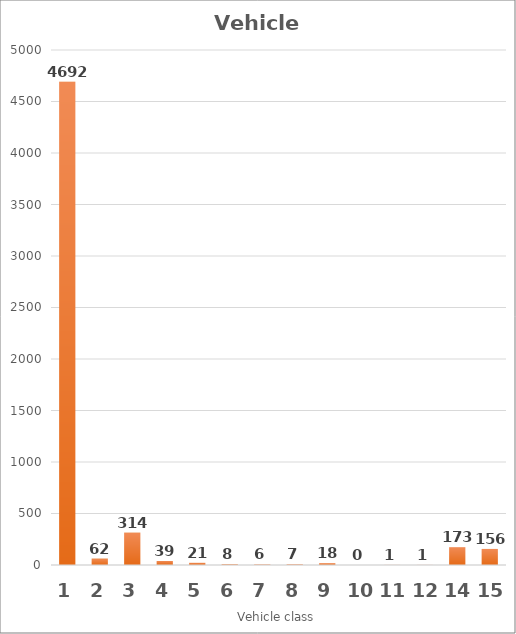
| Category | Series 0 |
|---|---|
| 1.0 | 4692 |
| 2.0 | 62 |
| 3.0 | 314 |
| 4.0 | 39 |
| 5.0 | 21 |
| 6.0 | 8 |
| 7.0 | 6 |
| 8.0 | 7 |
| 9.0 | 18 |
| 10.0 | 0 |
| 11.0 | 1 |
| 12.0 | 1 |
| 14.0 | 173 |
| 15.0 | 156 |